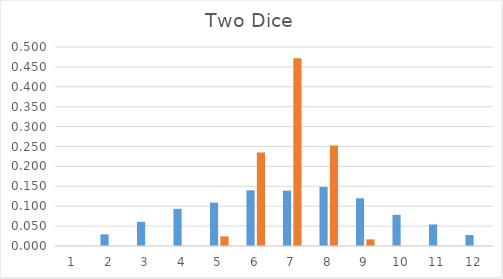
| Category | Series 0 | Series 1 |
|---|---|---|
| 0 | 0 | 0 |
| 1 | 0.029 | 0 |
| 2 | 0.061 | 0 |
| 3 | 0.093 | 0 |
| 4 | 0.109 | 0.024 |
| 5 | 0.14 | 0.235 |
| 6 | 0.139 | 0.472 |
| 7 | 0.148 | 0.252 |
| 8 | 0.12 | 0.017 |
| 9 | 0.078 | 0 |
| 10 | 0.054 | 0 |
| 11 | 0.028 | 0 |